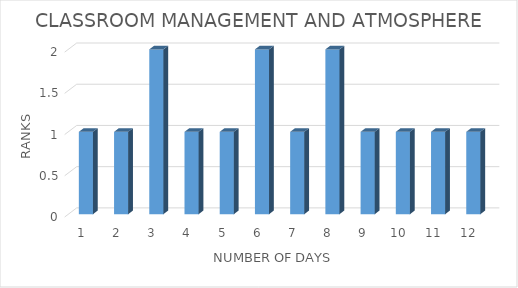
| Category | Series 0 |
|---|---|
| 0 | 1 |
| 1 | 1 |
| 2 | 2 |
| 3 | 1 |
| 4 | 1 |
| 5 | 2 |
| 6 | 1 |
| 7 | 2 |
| 8 | 1 |
| 9 | 1 |
| 10 | 1 |
| 11 | 1 |